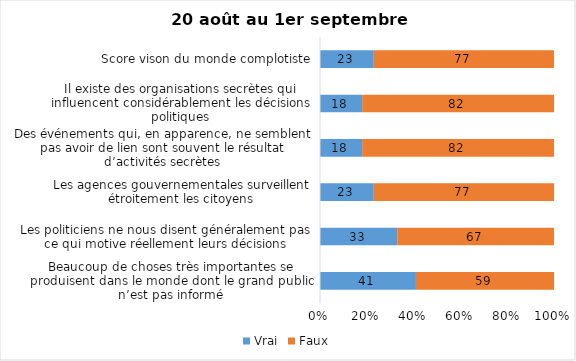
| Category | Vrai | Faux |
|---|---|---|
| Beaucoup de choses très importantes se produisent dans le monde dont le grand public n’est pas informé | 41 | 59 |
| Les politiciens ne nous disent généralement pas ce qui motive réellement leurs décisions | 33 | 67 |
| Les agences gouvernementales surveillent étroitement les citoyens | 23 | 77 |
| Des événements qui, en apparence, ne semblent pas avoir de lien sont souvent le résultat d’activités secrètes | 18 | 82 |
| Il existe des organisations secrètes qui influencent considérablement les décisions politiques | 18 | 82 |
| Score vison du monde complotiste | 23 | 77 |